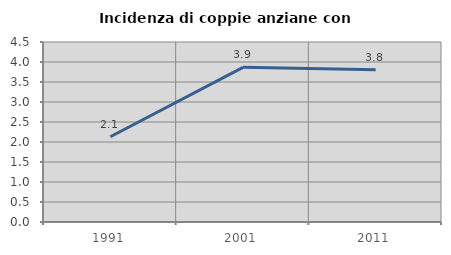
| Category | Incidenza di coppie anziane con figli |
|---|---|
| 1991.0 | 2.131 |
| 2001.0 | 3.866 |
| 2011.0 | 3.803 |